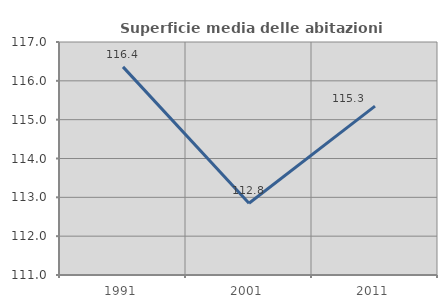
| Category | Superficie media delle abitazioni occupate |
|---|---|
| 1991.0 | 116.359 |
| 2001.0 | 112.848 |
| 2011.0 | 115.349 |